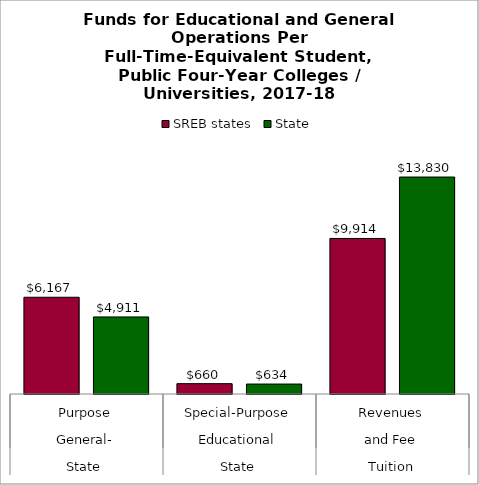
| Category | SREB states | State |
|---|---|---|
| 0 | 6166.807 | 4911.426 |
| 1 | 659.716 | 634.021 |
| 2 | 9914.449 | 13830.497 |